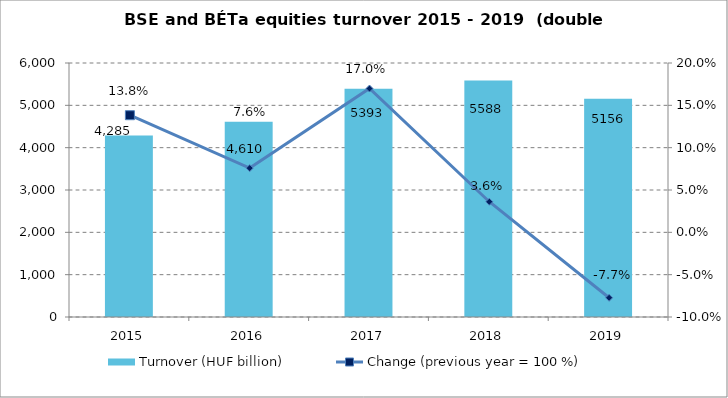
| Category | Turnover (HUF billion) |
|---|---|
| 2015.0 | 4284.718 |
| 2016.0 | 4610 |
| 2017.0 | 5393 |
| 2018.0 | 5588 |
| 2019.0 | 5156 |